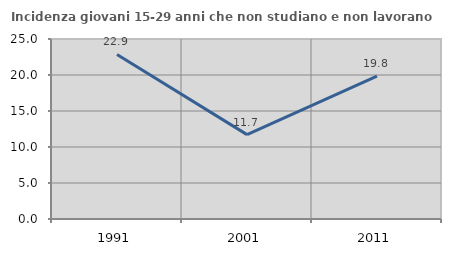
| Category | Incidenza giovani 15-29 anni che non studiano e non lavorano  |
|---|---|
| 1991.0 | 22.857 |
| 2001.0 | 11.719 |
| 2011.0 | 19.833 |